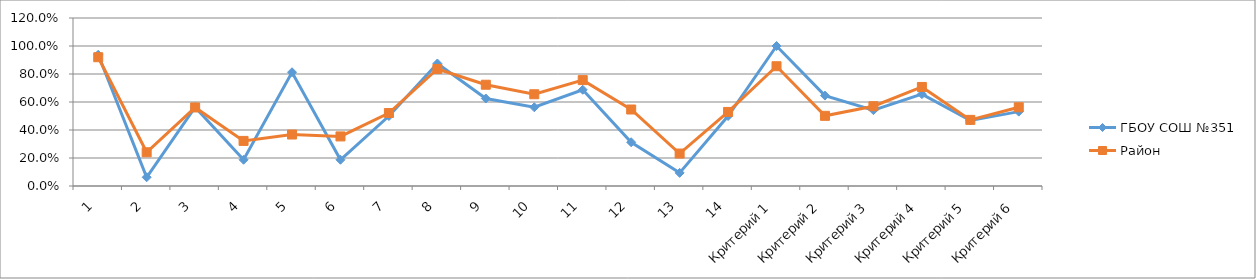
| Category | ГБОУ СОШ №351 | Район |
|---|---|---|
| 1 | 0.938 | 0.92 |
| 2 | 0.062 | 0.241 |
| 3 | 0.562 | 0.561 |
| 4 | 0.188 | 0.322 |
| 5 | 0.812 | 0.368 |
| 6 | 0.188 | 0.354 |
| 7 | 0.5 | 0.521 |
| 8 | 0.875 | 0.836 |
| 9 | 0.625 | 0.723 |
| 10 | 0.562 | 0.655 |
| 11 | 0.688 | 0.756 |
| 12 | 0.312 | 0.546 |
| 13 | 0.094 | 0.232 |
| 14 | 0.5 | 0.529 |
| Критерий 1 | 1 | 0.855 |
| Критерий 2 | 0.646 | 0.501 |
| Критерий 3 | 0.542 | 0.57 |
| Критерий 4 | 0.656 | 0.707 |
| Критерий 5 | 0.469 | 0.472 |
| Критерий 6 | 0.531 | 0.562 |